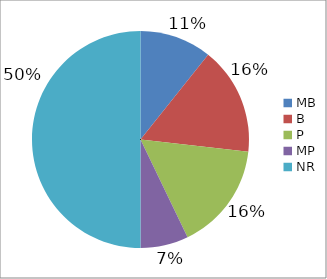
| Category | Series 0 |
|---|---|
| MB | 0.107 |
| B | 0.161 |
| P | 0.161 |
| MP | 0.071 |
| NR | 0.5 |